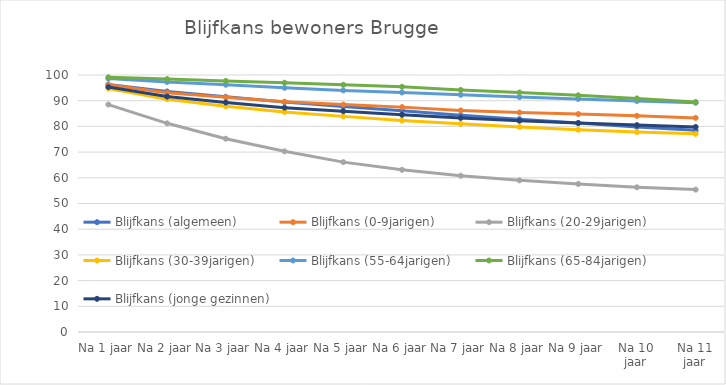
| Category | Blijfkans (algemeen) | Blijfkans (0-9jarigen) | Blijfkans (20-29jarigen) | Blijfkans (30-39jarigen) | Blijfkans (55-64jarigen) | Blijfkans (65-84jarigen) | Blijfkans (jonge gezinnen) |
|---|---|---|---|---|---|---|---|
| Na 1 jaar | 96.3 | 96.2 | 88.5 | 94.7 | 98.6 | 99.1 | 95.3 |
| Na 2 jaar | 93.6 | 93.1 | 81.2 | 90.6 | 97.3 | 98.4 | 91.6 |
| Na 3 jaar | 91.5 | 91.3 | 75.2 | 87.8 | 96.2 | 97.7 | 89.3 |
| Na 4 jaar | 89.5 | 89.6 | 70.3 | 85.6 | 95 | 97 | 87.3 |
| Na 5 jaar | 87.7 | 88.5 | 66.1 | 83.9 | 94 | 96.2 | 85.9 |
| Na 6 jaar | 86.1 | 87.5 | 63.1 | 82.3 | 93.2 | 95.4 | 84.5 |
| Na 7 jaar | 84.3 | 86.2 | 60.8 | 81 | 92.3 | 94.2 | 83.3 |
| Na 8 jaar | 82.8 | 85.4 | 59 | 79.8 | 91.4 | 93.2 | 82.2 |
| Na 9 jaar | 81.3 | 84.8 | 57.6 | 78.7 | 90.7 | 92.1 | 81.3 |
| Na 10 jaar | 79.8 | 84.1 | 56.3 | 77.8 | 89.9 | 90.9 | 80.5 |
| Na 11 jaar | 78.5 | 83.3 | 55.4 | 77.1 | 89.2 | 89.5 | 79.8 |